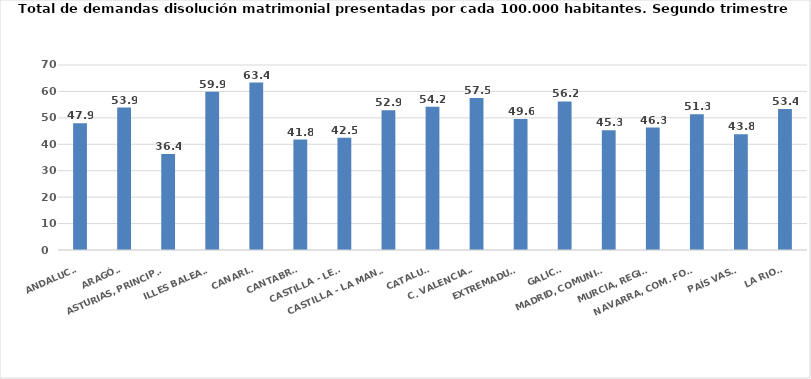
| Category | Series 0 |
|---|---|
| ANDALUCÍA | 47.935 |
| ARAGÓN | 53.879 |
| ASTURIAS, PRINCIPADO | 36.36 |
| ILLES BALEARS | 59.914 |
| CANARIAS | 63.356 |
| CANTABRIA | 41.799 |
| CASTILLA - LEÓN | 42.475 |
| CASTILLA - LA MANCHA | 52.869 |
| CATALUÑA | 54.184 |
| C. VALENCIANA | 57.529 |
| EXTREMADURA | 49.606 |
| GALICIA | 56.191 |
| MADRID, COMUNIDAD | 45.335 |
| MURCIA, REGIÓN | 46.307 |
| NAVARRA, COM. FORAL | 51.324 |
| PAÍS VASCO | 43.831 |
| LA RIOJA | 53.373 |